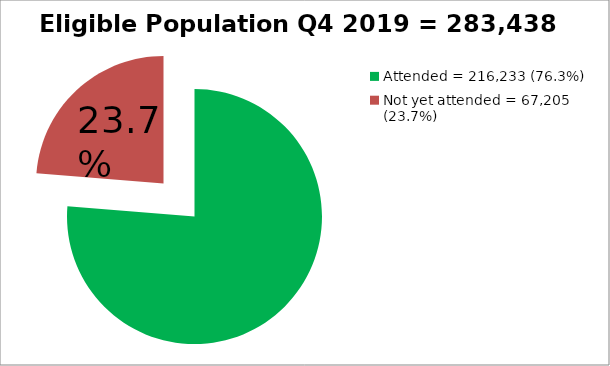
| Category | Eligible Population Q4 2018= 283,438 |
|---|---|
| Attended = 216,233 (76.3%) | 216233 |
| Not yet attended = 67,205 (23.7%)  | 67205 |